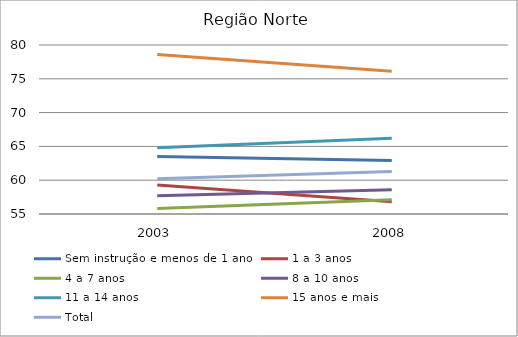
| Category | Sem instrução e menos de 1 ano | 1 a 3 anos | 4 a 7 anos | 8 a 10 anos | 11 a 14 anos | 15 anos e mais | Total |
|---|---|---|---|---|---|---|---|
| 2003.0 | 63.5 | 59.3 | 55.8 | 57.7 | 64.8 | 78.6 | 60.2 |
| 2008.0 | 62.9 | 56.8 | 57.1 | 58.6 | 66.2 | 76.1 | 61.3 |